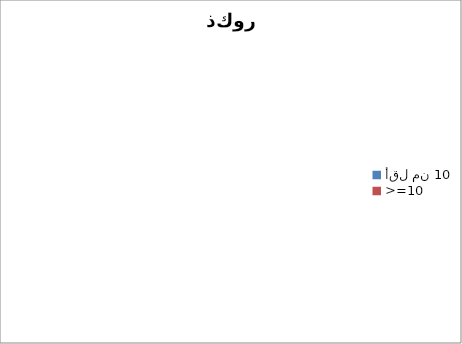
| Category | ذكور | إناث |
|---|---|---|
| أقل من 10 | 0 | 0 |
| >=10 | 0 | 0 |